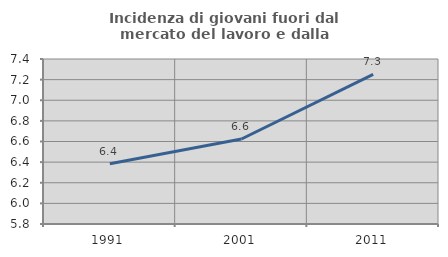
| Category | Incidenza di giovani fuori dal mercato del lavoro e dalla formazione  |
|---|---|
| 1991.0 | 6.384 |
| 2001.0 | 6.624 |
| 2011.0 | 7.251 |